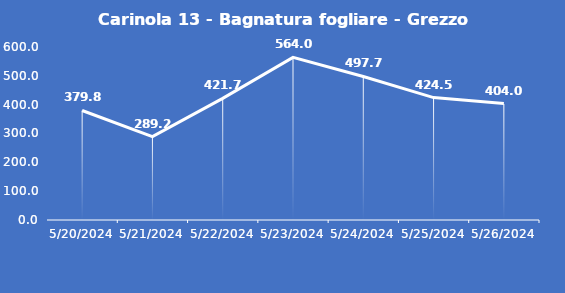
| Category | Carinola 13 - Bagnatura fogliare - Grezzo (min) |
|---|---|
| 5/20/24 | 379.8 |
| 5/21/24 | 289.2 |
| 5/22/24 | 421.7 |
| 5/23/24 | 564 |
| 5/24/24 | 497.7 |
| 5/25/24 | 424.5 |
| 5/26/24 | 404 |